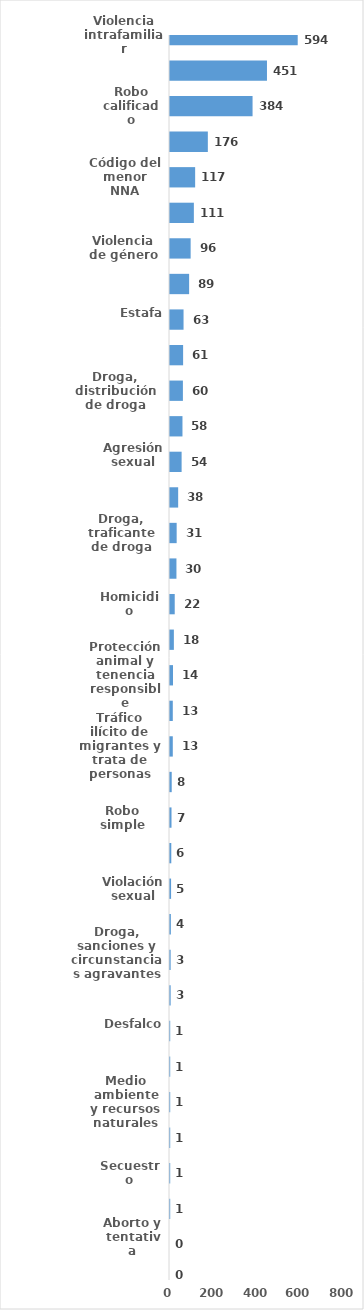
| Category | Series 0 |
|---|---|
| Violencia intrafamiliar | 594 |
| Amenaza | 451 |
| Robo calificado | 384 |
| Golpes y heridas | 176 |
| Código del menor NNA | 117 |
| Daños y perjuicios a la cosa ajena | 111 |
| Violencia de género | 96 |
| Droga, simple posesión | 89 |
| Estafa | 63 |
| Crímenes y delitos de alta tecnología | 61 |
| Droga, distribución de droga | 60 |
| Abuso de confianza | 58 |
| Agresión sexual | 54 |
| Código de trabajo | 38 |
| Droga, traficante de droga | 31 |
| Ley de armas | 30 |
| Homicidio | 22 |
| Tentativa de homicidio | 18 |
| Protección animal y tenencia responsible | 14 |
| Crímenes y delitos contra la propiedad | 13 |
| Tráfico ilícito de migrantes y trata de personas | 13 |
| Propiedad industrial, intelectual y derecho de autor | 8 |
| Robo simple | 7 |
| Asociación de malhechores | 6 |
| Violación sexual | 5 |
| Desaparición | 4 |
| Droga, sanciones y circunstancias agravantes | 3 |
| Tránsito y seguridad vial  | 3 |
| Desfalco | 1 |
| Ley general de salud | 1 |
| Medio ambiente y recursos naturales | 1 |
| Pérdida de documento de identidad | 1 |
| Secuestro | 1 |
| Soborno | 1 |
| Aborto y tentativa | 0 |
| Conflictos sociales | 0 |